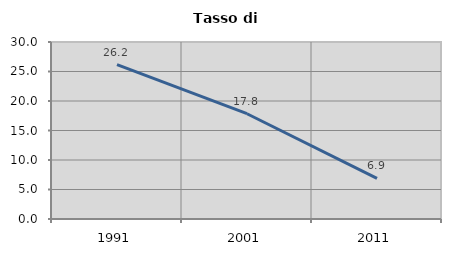
| Category | Tasso di disoccupazione   |
|---|---|
| 1991.0 | 26.154 |
| 2001.0 | 17.844 |
| 2011.0 | 6.897 |